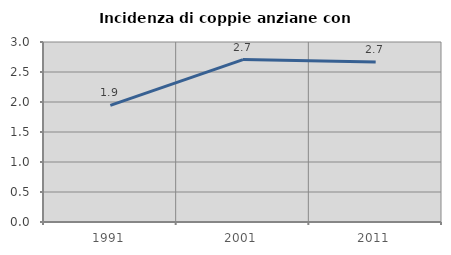
| Category | Incidenza di coppie anziane con figli |
|---|---|
| 1991.0 | 1.944 |
| 2001.0 | 2.707 |
| 2011.0 | 2.666 |